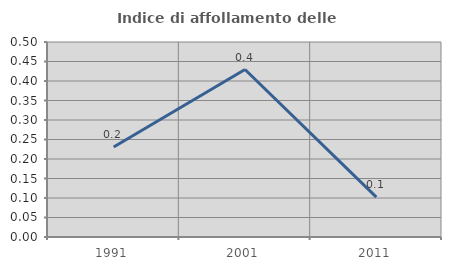
| Category | Indice di affollamento delle abitazioni  |
|---|---|
| 1991.0 | 0.231 |
| 2001.0 | 0.429 |
| 2011.0 | 0.102 |